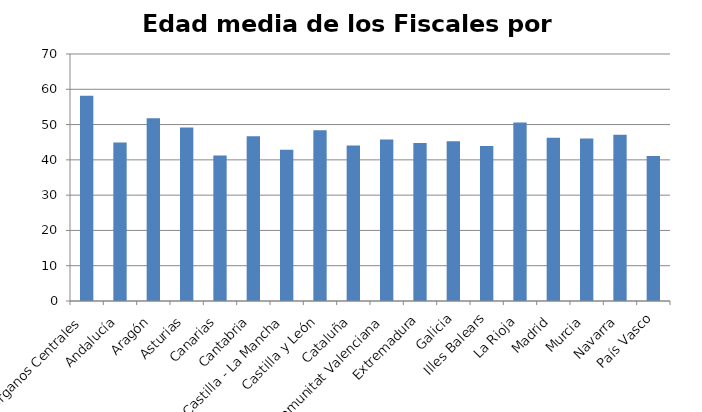
| Category | Edad Media |
|---|---|
| Órganos Centrales | 58.168 |
| Andalucía | 44.94 |
| Aragón | 51.794 |
| Asturias | 49.2 |
| Canarias | 41.208 |
| Cantabria | 46.69 |
| Castilla - La Mancha | 42.86 |
| Castilla y León | 48.419 |
| Cataluña | 44.082 |
| Comunitat Valenciana | 45.758 |
| Extremadura | 44.804 |
| Galicia | 45.25 |
| Illes Balears | 43.949 |
| La Rioja | 50.615 |
| Madrid | 46.266 |
| Murcia | 46.05 |
| Navarra | 47.143 |
| País Vasco | 41.074 |